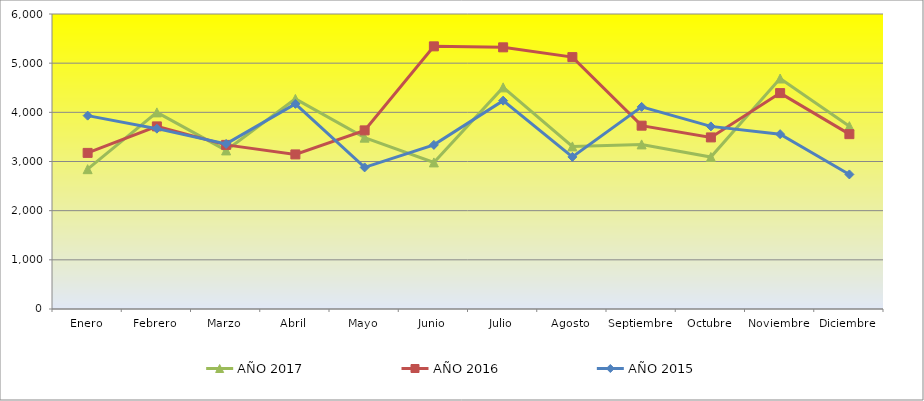
| Category | AÑO 2017 | AÑO 2016 | AÑO 2015 |
|---|---|---|---|
| Enero | 2844.035 | 3175 | 3933 |
| Febrero | 3998.947 | 3714 | 3668 |
| Marzo | 3225.614 | 3338 | 3358 |
| Abril | 4273.684 | 3144 | 4172 |
| Mayo | 3485.088 | 3633 | 2880 |
| Junio | 2981.404 | 5342 | 3338 |
| Julio | 4507.719 | 5322 | 4238 |
| Agosto | 3307.018 | 5123 | 3093 |
| Septiembre | 3347.719 | 3729 | 4111 |
| Octubre | 3091.525 | 3490 | 3714 |
| Noviembre | 4688.136 | 4391 | 3556 |
| Diciembre | 3719.123 | 3556 | 2737 |